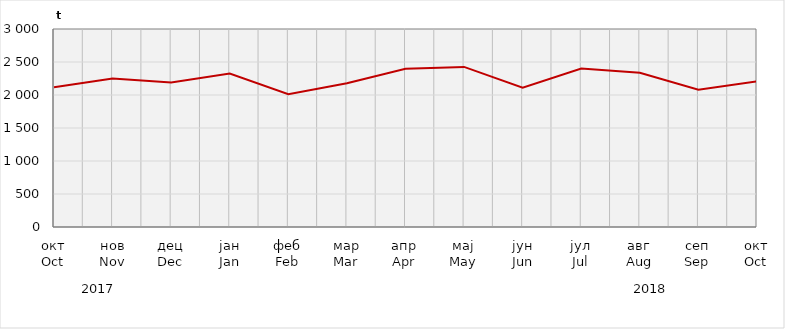
| Category | Нето тежина заклане стоке                              Net weight of  slaughtered livestock |
|---|---|
| окт
Oct | 2118775.52 |
| нов
Nov | 2248639.95 |
| дец
Dec | 2190874.83 |
| јан
Jan | 2324971.47 |
| феб
Feb | 2010400 |
| мар
Mar | 2177800 |
| апр
Apr | 2398200 |
| мај
May | 2425732.22 |
| јун
Jun | 2110195.14 |
| јул
Jul | 2402333.82 |
| авг
Aug | 2338329.68 |
| сеп
Sep | 2078476.26 |
| окт
Oct | 2208490.52 |